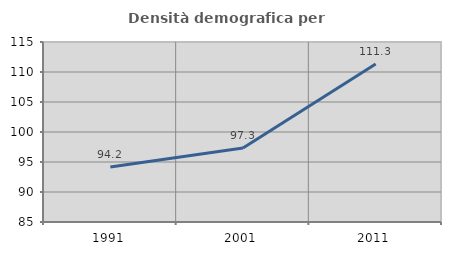
| Category | Densità demografica |
|---|---|
| 1991.0 | 94.166 |
| 2001.0 | 97.319 |
| 2011.0 | 111.326 |